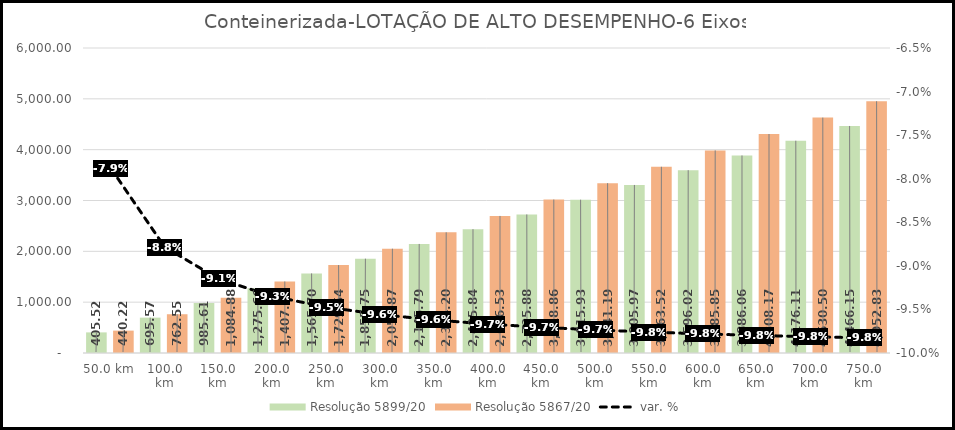
| Category | Resolução 5899/20 | Resolução 5867/20 |
|---|---|---|
| 50.0 | 405.525 | 440.22 |
| 100.0 | 695.57 | 762.549 |
| 150.0 | 985.614 | 1084.879 |
| 200.0 | 1275.659 | 1407.208 |
| 250.0 | 1565.704 | 1729.538 |
| 300.0 | 1855.749 | 2051.868 |
| 350.0 | 2145.794 | 2374.197 |
| 400.0 | 2435.838 | 2696.527 |
| 450.0 | 2725.883 | 3018.856 |
| 500.0 | 3015.928 | 3341.186 |
| 550.0 | 3305.973 | 3663.516 |
| 600.0 | 3596.018 | 3985.845 |
| 650.0 | 3886.062 | 4308.175 |
| 700.0 | 4176.107 | 4630.504 |
| 750.0 | 4466.152 | 4952.834 |